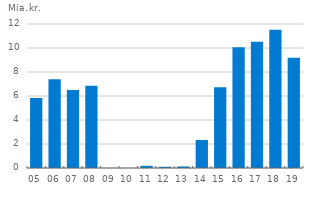
| Category | Udbyttebetalinger |
|---|---|
| 05 | 5.839 |
| 06 | 7.405 |
| 07 | 6.503 |
| 08 | 6.857 |
| 09 | 0 |
| 10 | 0 |
| 11 | 0.184 |
| 12 | 0.102 |
| 13 | 0.13 |
| 14 | 2.336 |
| 15 | 6.731 |
| 16 | 10.071 |
| 17 | 10.516 |
| 18 | 11.515 |
| 19 | 9.191 |